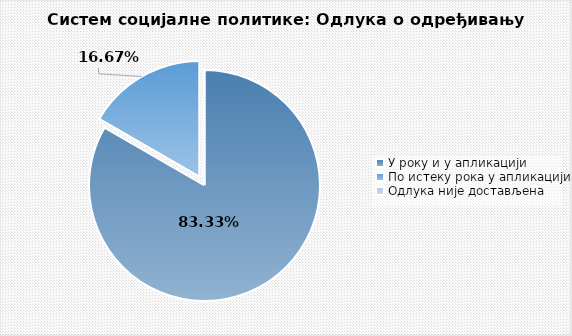
| Category | Series 0 |
|---|---|
| У року и у апликацији | 0.833 |
| По истеку рока у апликацији | 0.167 |
| Одлука није достављена | 0 |